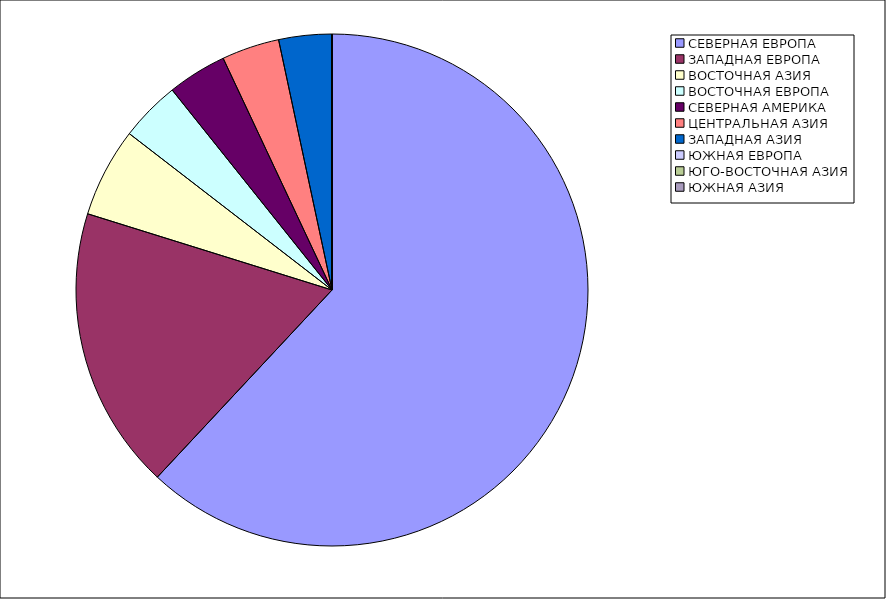
| Category | Оборот |
|---|---|
| СЕВЕРНАЯ ЕВРОПА | 61.95 |
| ЗАПАДНАЯ ЕВРОПА | 17.861 |
| ВОСТОЧНАЯ АЗИЯ | 5.646 |
| ВОСТОЧНАЯ ЕВРОПА | 3.812 |
| СЕВЕРНАЯ АМЕРИКА | 3.742 |
| ЦЕНТРАЛЬНАЯ АЗИЯ | 3.641 |
| ЗАПАДНАЯ АЗИЯ | 3.342 |
| ЮЖНАЯ ЕВРОПА | 0.005 |
| ЮГО-ВОСТОЧНАЯ АЗИЯ | 0 |
| ЮЖНАЯ АЗИЯ | 0 |